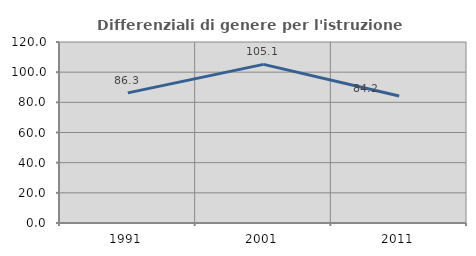
| Category | Differenziali di genere per l'istruzione superiore |
|---|---|
| 1991.0 | 86.252 |
| 2001.0 | 105.147 |
| 2011.0 | 84.205 |